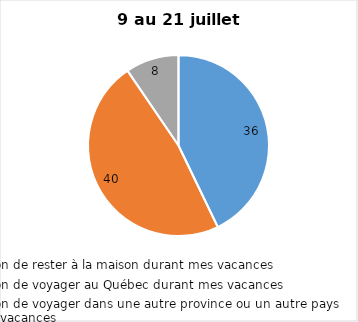
| Category | Series 0 |
|---|---|
| J’ai l’intention de rester à la maison durant mes vacances | 36 |
| J’ai l’intention de voyager au Québec durant mes vacances | 40 |
| J’ai l’intention de voyager dans une autre province ou un autre pays durant mes vacances | 8 |